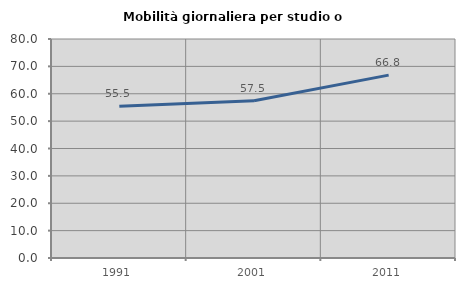
| Category | Mobilità giornaliera per studio o lavoro |
|---|---|
| 1991.0 | 55.477 |
| 2001.0 | 57.473 |
| 2011.0 | 66.8 |